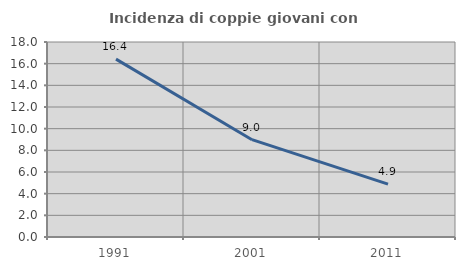
| Category | Incidenza di coppie giovani con figli |
|---|---|
| 1991.0 | 16.418 |
| 2001.0 | 8.982 |
| 2011.0 | 4.886 |